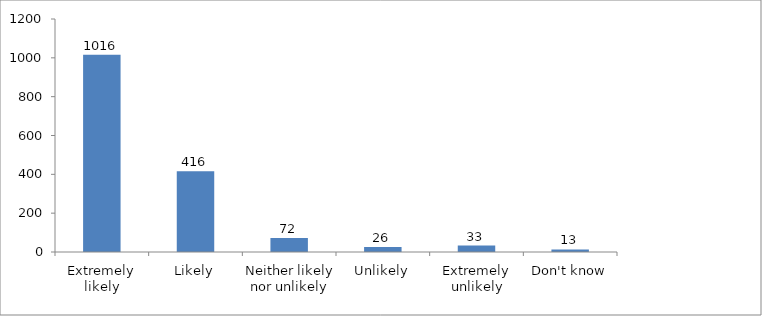
| Category | Series 0 |
|---|---|
| Extremely likely | 1016 |
| Likely | 416 |
| Neither likely nor unlikely | 72 |
| Unlikely | 26 |
| Extremely unlikely | 33 |
| Don't know | 13 |